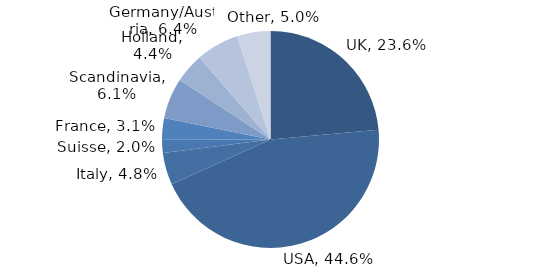
| Category | Investment Style |
|---|---|
| UK | 0.236 |
| USA | 0.446 |
| Italy | 0.048 |
| Suisse | 0.02 |
| France | 0.031 |
| Scandinavia | 0.061 |
| Holland | 0.044 |
| Germany/Austria | 0.064 |
| Other | 0.05 |